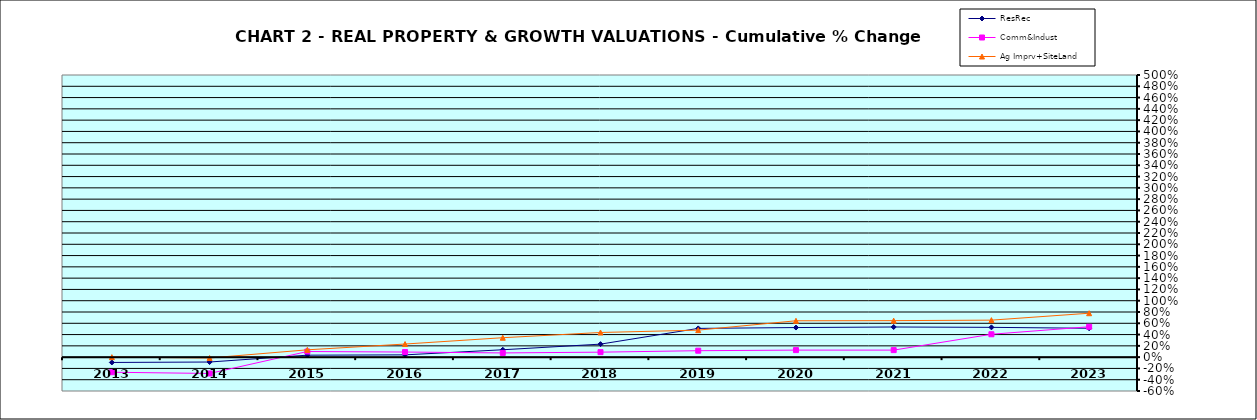
| Category | ResRec | Comm&Indust | Ag Imprv+SiteLand |
|---|---|---|---|
| 2013.0 | -0.094 | -0.267 | 0 |
| 2014.0 | -0.087 | -0.289 | -0.015 |
| 2015.0 | 0.035 | 0.1 | 0.13 |
| 2016.0 | 0.04 | 0.09 | 0.232 |
| 2017.0 | 0.131 | 0.075 | 0.344 |
| 2018.0 | 0.231 | 0.088 | 0.437 |
| 2019.0 | 0.509 | 0.114 | 0.479 |
| 2020.0 | 0.524 | 0.124 | 0.645 |
| 2021.0 | 0.534 | 0.124 | 0.647 |
| 2022.0 | 0.528 | 0.406 | 0.656 |
| 2023.0 | 0.512 | 0.539 | 0.778 |